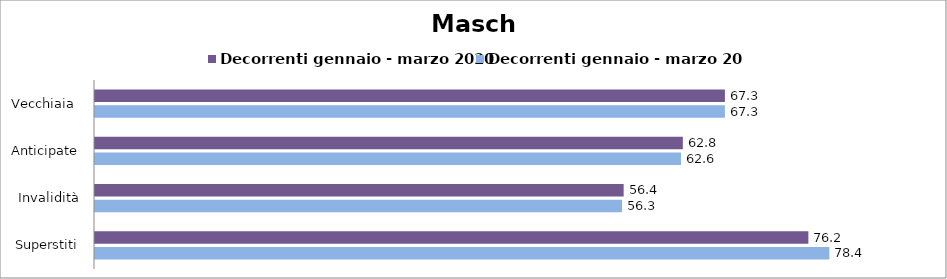
| Category | Decorrenti gennaio - marzo 2020 | Decorrenti gennaio - marzo 2021 |
|---|---|---|
| Vecchiaia  | 67.25 | 67.25 |
| Anticipate | 62.76 | 62.56 |
| Invalidità | 56.44 | 56.27 |
| Superstiti | 76.16 | 78.4 |